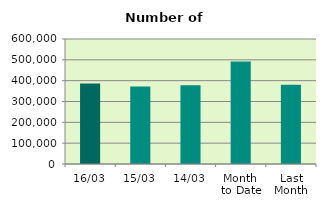
| Category | Series 0 |
|---|---|
| 16/03 | 386042 |
| 15/03 | 372368 |
| 14/03 | 378052 |
| Month 
to Date | 491827.333 |
| Last
Month | 380345.4 |